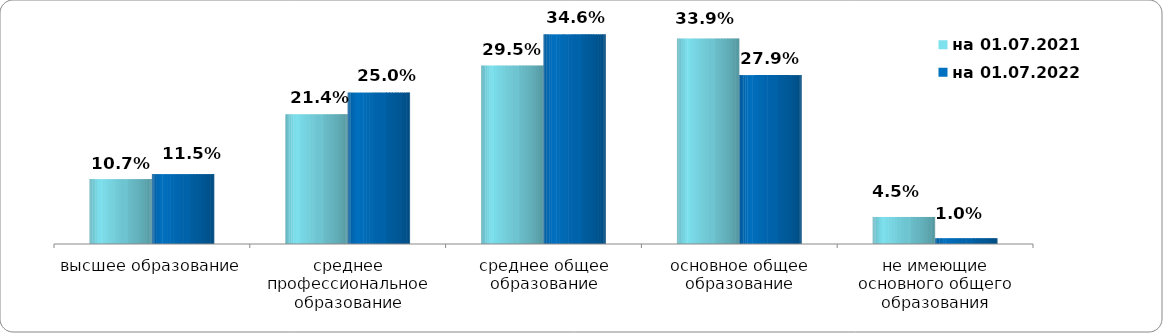
| Category | на 01.07.2021 | на 01.07.2022 |
|---|---|---|
| высшее образование | 0.107 | 0.115 |
| среднее профессиональное образование | 0.214 | 0.25 |
| среднее общее образование | 0.295 | 0.346 |
| основное общее образование | 0.339 | 0.279 |
| не имеющие основного общего образования | 0.045 | 0.01 |